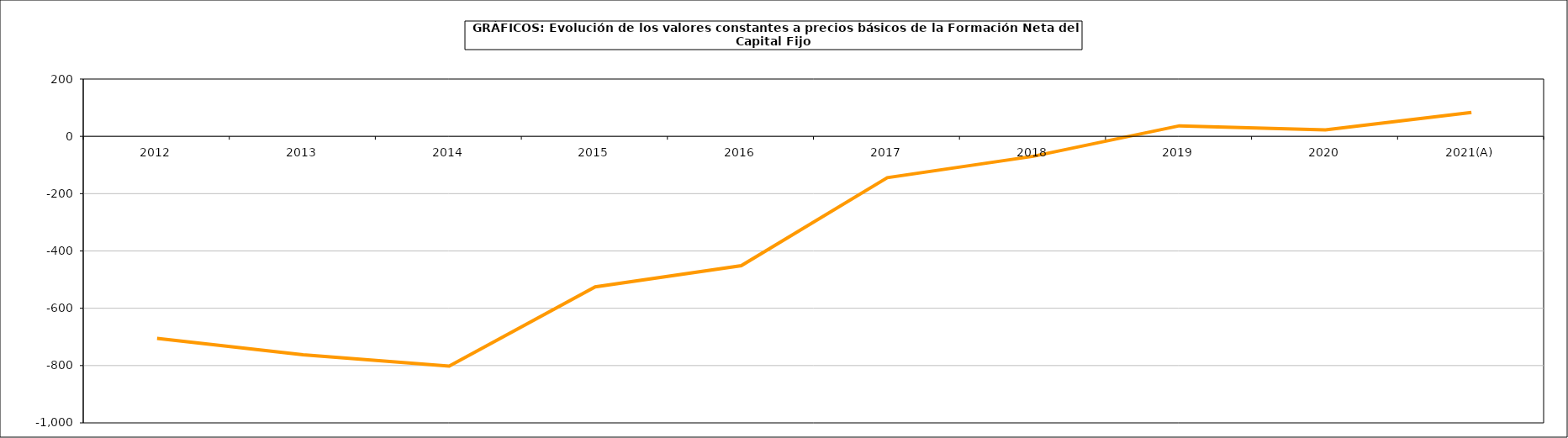
| Category | Formación neta del capital fijo |
|---|---|
| 2012 | -705.278 |
| 2013 | -762.085 |
| 2014 | -801.713 |
| 2015 | -525.232 |
| 2016 | -451.31 |
| 2017 | -144.411 |
| 2018 | -69.584 |
| 2019 | 36.71 |
| 2020 | 22.459 |
| 2021(A) | 83.597 |